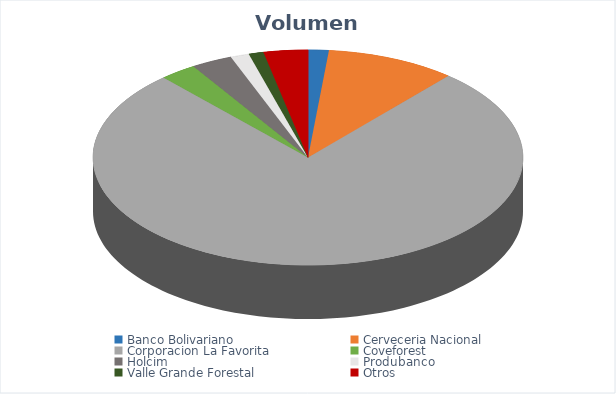
| Category | VOLUMEN ($USD) |
|---|---|
| Banco Bolivariano | 2800 |
| Cerveceria Nacional | 17600 |
| Corporacion La Favorita | 138995.76 |
| Coveforest | 5005 |
| Holcim | 5600 |
| Produbanco | 2522.84 |
| Valle Grande Forestal | 2002 |
| Otros | 6000 |